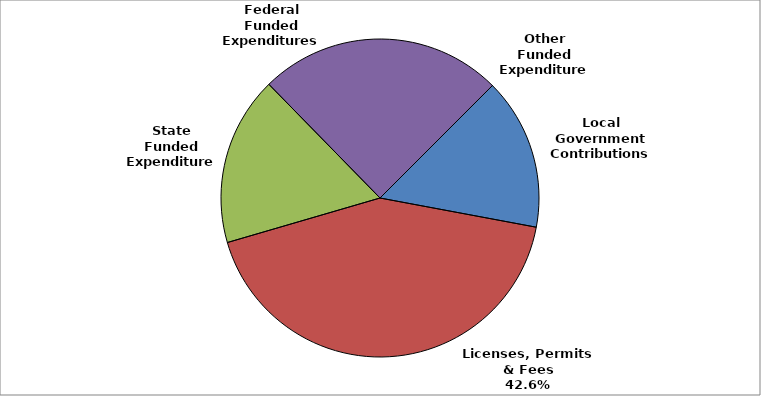
| Category | Series 0 |
|---|---|
| Local Government Contributions | 0.154 |
| Licenses, Permits & Fees | 0.425 |
| State Funded Expenditures | 0.172 |
| Federal Funded Expenditures | 0.248 |
| Other Funded Expenditures | 0 |